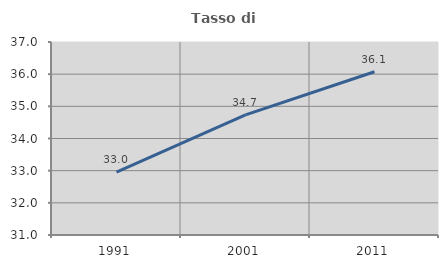
| Category | Tasso di occupazione   |
|---|---|
| 1991.0 | 32.952 |
| 2001.0 | 34.736 |
| 2011.0 | 36.074 |